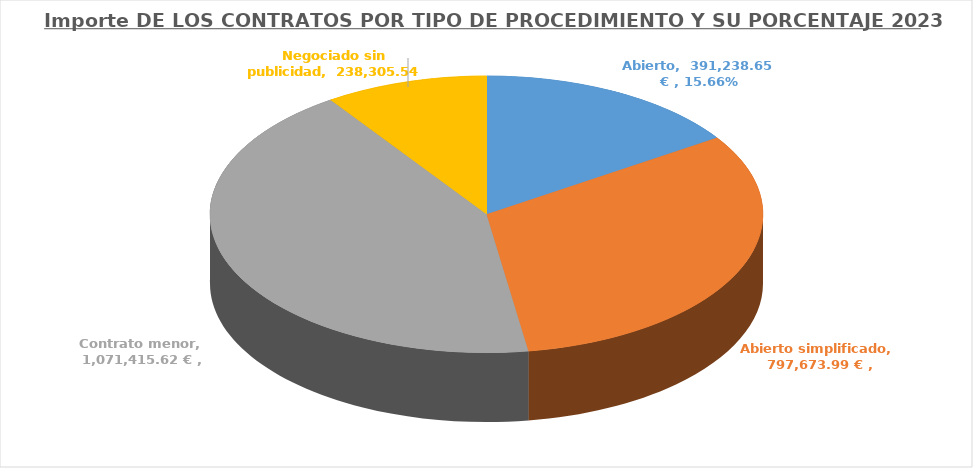
| Category | SUMA DE IMPORTE SIN IMPUESTOS | PORCENTAJE POR IMPORTES |
|---|---|---|
| Abierto | 391238.65 | 0.157 |
| Abierto simplificado | 797673.989 | 0.319 |
| Contrato menor | 1071415.618 | 0.429 |
| Negociado sin publicidad | 238305.54 | 0.095 |